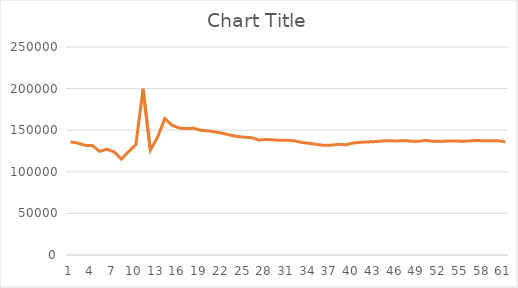
| Category | Series 0 |
|---|---|
| 0 | 135967 |
| 1 | 134555 |
| 2 | 131697 |
| 3 | 131690 |
| 4 | 124475 |
| 5 | 127142 |
| 6 | 123983 |
| 7 | 115150 |
| 8 | 124353 |
| 9 | 132597 |
| 10 | 199765 |
| 11 | 126136 |
| 12 | 141623 |
| 13 | 164010 |
| 14 | 155874 |
| 15 | 152542 |
| 16 | 151965 |
| 17 | 152355 |
| 18 | 149846 |
| 19 | 149269 |
| 20 | 147807 |
| 21 | 146233 |
| 22 | 144063 |
| 23 | 142367 |
| 24 | 141537 |
| 25 | 140970 |
| 26 | 138208 |
| 27 | 138880 |
| 28 | 138354 |
| 29 | 137778 |
| 30 | 137879 |
| 31 | 137056 |
| 32 | 135128 |
| 33 | 134180 |
| 34 | 132814 |
| 35 | 131747 |
| 36 | 132095 |
| 37 | 133058 |
| 38 | 132508 |
| 39 | 134618 |
| 40 | 135467 |
| 41 | 135891 |
| 42 | 136274 |
| 43 | 137111 |
| 44 | 137445 |
| 45 | 136941 |
| 46 | 137587 |
| 47 | 136784 |
| 48 | 136583 |
| 49 | 137836 |
| 50 | 136616 |
| 51 | 136552 |
| 52 | 136904 |
| 53 | 137147 |
| 54 | 136632 |
| 55 | 137017 |
| 56 | 137717 |
| 57 | 137263 |
| 58 | 137258 |
| 59 | 137282 |
| 60 | 136077 |